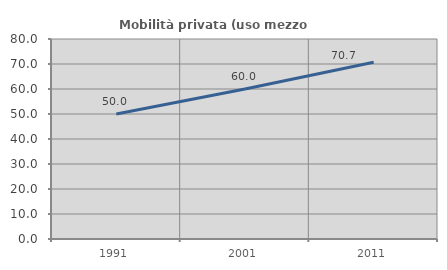
| Category | Mobilità privata (uso mezzo privato) |
|---|---|
| 1991.0 | 50 |
| 2001.0 | 60 |
| 2011.0 | 70.707 |